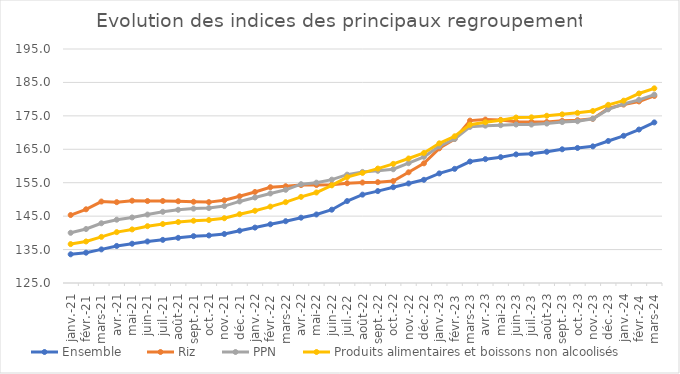
| Category |  Ensemble  |  Riz  |  PPN  |  Produits alimentaires et boissons non alcoolisés  |
|---|---|---|---|---|
| 2021-01-01 | 133.582 | 145.33 | 140.014 | 136.64 |
| 2021-02-01 | 134.068 | 147.047 | 141.147 | 137.422 |
| 2021-03-01 | 135.051 | 149.367 | 142.872 | 138.8 |
| 2021-04-01 | 136.088 | 149.178 | 143.938 | 140.217 |
| 2021-05-01 | 136.75 | 149.619 | 144.606 | 141.028 |
| 2021-06-01 | 137.421 | 149.519 | 145.469 | 142.002 |
| 2021-07-01 | 137.905 | 149.532 | 146.302 | 142.639 |
| 2021-08-01 | 138.51 | 149.461 | 146.899 | 143.242 |
| 2021-09-01 | 139.014 | 149.302 | 147.252 | 143.631 |
| 2021-10-01 | 139.227 | 149.196 | 147.416 | 143.832 |
| 2021-11-01 | 139.66 | 149.736 | 148.006 | 144.381 |
| 2021-12-01 | 140.647 | 150.942 | 149.401 | 145.589 |
| 2022-01-01 | 141.575 | 152.225 | 150.572 | 146.611 |
| 2022-02-01 | 142.565 | 153.658 | 151.785 | 147.854 |
| 2022-03-01 | 143.49 | 153.947 | 152.881 | 149.188 |
| 2022-04-01 | 144.542 | 154.286 | 154.56 | 150.765 |
| 2022-05-01 | 145.5 | 154.308 | 155.011 | 152.074 |
| 2022-06-01 | 146.929 | 154.397 | 155.916 | 154.212 |
| 2022-07-01 | 149.51 | 154.848 | 157.411 | 156.664 |
| 2022-08-01 | 151.429 | 155.056 | 158.224 | 157.93 |
| 2022-09-01 | 152.495 | 155.168 | 158.567 | 159.229 |
| 2022-10-01 | 153.659 | 155.499 | 159.025 | 160.634 |
| 2022-11-01 | 154.778 | 158.112 | 160.842 | 162.244 |
| 2022-12-01 | 155.868 | 160.795 | 162.741 | 163.889 |
| 2023-01-01 | 157.78 | 165.289 | 165.928 | 166.783 |
| 2023-02-01 | 159.146 | 168.082 | 168.07 | 168.879 |
| 2023-03-01 | 161.33 | 173.573 | 171.71 | 172.334 |
| 2023-04-01 | 162.047 | 173.895 | 172.074 | 173.1 |
| 2023-05-01 | 162.649 | 173.786 | 172.207 | 173.691 |
| 2023-06-01 | 163.471 | 173.218 | 172.406 | 174.499 |
| 2023-07-01 | 163.661 | 173.19 | 172.397 | 174.557 |
| 2023-08-01 | 164.258 | 173.164 | 172.694 | 175.026 |
| 2023-09-01 | 164.998 | 173.503 | 173.138 | 175.45 |
| 2023-10-01 | 165.397 | 173.714 | 173.381 | 175.897 |
| 2023-11-01 | 165.874 | 174.101 | 174.147 | 176.454 |
| 2023-12-01 | 167.482 | 177.228 | 176.947 | 178.302 |
| 2024-01-01 | 169.034 | 178.373 | 178.538 | 179.541 |
| 2024-02-01 | 170.899 | 179.307 | 179.782 | 181.683 |
| 2024-03-01 | 173.038 | 180.955 | 181.344 | 183.231 |